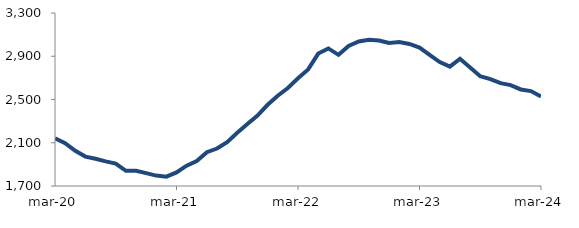
| Category | Series 0 |
|---|---|
| 2020-03-01 | 2140.312 |
| 2020-04-01 | 2095.806 |
| 2020-05-01 | 2025.041 |
| 2020-06-01 | 1971.807 |
| 2020-07-01 | 1951.466 |
| 2020-08-01 | 1927.763 |
| 2020-09-01 | 1907.078 |
| 2020-10-01 | 1840.778 |
| 2020-11-01 | 1841.166 |
| 2020-12-01 | 1819.546 |
| 2021-01-01 | 1796.45 |
| 2021-02-01 | 1786.603 |
| 2021-03-01 | 1826.072 |
| 2021-04-01 | 1887.798 |
| 2021-05-01 | 1930.372 |
| 2021-06-01 | 2012.926 |
| 2021-07-01 | 2046.434 |
| 2021-08-01 | 2105.806 |
| 2021-09-01 | 2192.514 |
| 2021-10-01 | 2272.972 |
| 2021-11-01 | 2351.334 |
| 2021-12-01 | 2451.171 |
| 2022-01-01 | 2534.613 |
| 2022-02-01 | 2606.357 |
| 2022-03-01 | 2696.948 |
| 2022-04-01 | 2778.264 |
| 2022-05-01 | 2924.682 |
| 2022-06-01 | 2972.281 |
| 2022-07-01 | 2912.933 |
| 2022-08-01 | 2994.913 |
| 2022-09-01 | 3036.467 |
| 2022-10-01 | 3052.236 |
| 2022-11-01 | 3044.767 |
| 2022-12-01 | 3023.141 |
| 2023-01-01 | 3030.956 |
| 2023-02-01 | 3013.674 |
| 2023-03-01 | 2979.861 |
| 2023-04-01 | 2913.014 |
| 2023-05-01 | 2845.832 |
| 2023-06-01 | 2803.594 |
| 2023-07-01 | 2876.7 |
| 2023-08-01 | 2796.297 |
| 2023-09-01 | 2715.691 |
| 2023-10-01 | 2689.066 |
| 2023-11-01 | 2650.837 |
| 2023-12-01 | 2633.487 |
| 2024-01-01 | 2592.905 |
| 2024-02-01 | 2578.01 |
| 2024-03-01 | 2526.953 |